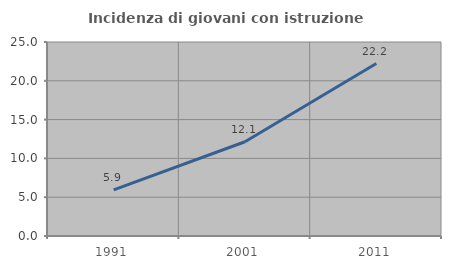
| Category | Incidenza di giovani con istruzione universitaria |
|---|---|
| 1991.0 | 5.946 |
| 2001.0 | 12.15 |
| 2011.0 | 22.222 |